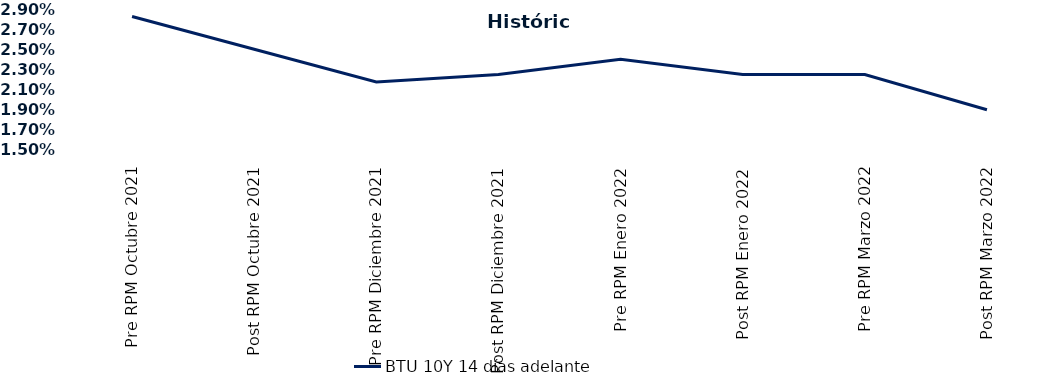
| Category | BTU 10Y 14 días adelante |
|---|---|
| Pre RPM Octubre 2021 | 0.028 |
| Post RPM Octubre 2021 | 0.025 |
| Pre RPM Diciembre 2021 | 0.022 |
| Post RPM Diciembre 2021 | 0.022 |
| Pre RPM Enero 2022 | 0.024 |
| Post RPM Enero 2022 | 0.022 |
| Pre RPM Marzo 2022 | 0.022 |
| Post RPM Marzo 2022 | 0.019 |